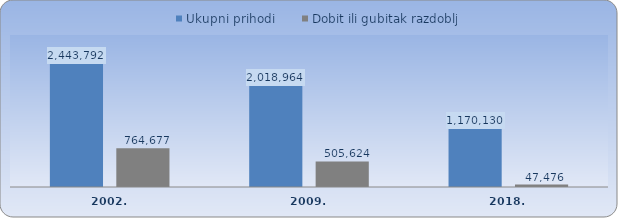
| Category | Ukupni prihodi | Dobit ili gubitak razdoblja |
|---|---|---|
| 2002. | 2443791.657 | 764677.236 |
| 2009.  | 2018963.819 | 505624.269 |
| 2018. | 1170130.2 | 47476.143 |